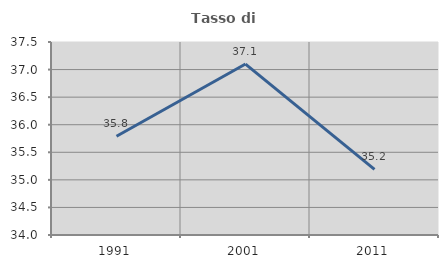
| Category | Tasso di occupazione   |
|---|---|
| 1991.0 | 35.79 |
| 2001.0 | 37.1 |
| 2011.0 | 35.19 |